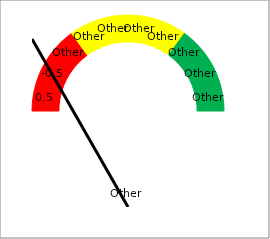
| Category | Series 0 |
|---|---|
| 10 | 0 |
|  | 1 |
|  | 0 |
|  | 1 |
|  | 0 |
|  | 1 |
| 7 | 0 |
|  | 1 |
|  | 0 |
|  | 1 |
| 5 | 0 |
|  | 1 |
|  | 0 |
|  | 1 |
| 3 | 0 |
|  | 1 |
|  | 0 |
|  | 1 |
|  | 0 |
|  | 1 |
| 0 | 0 |